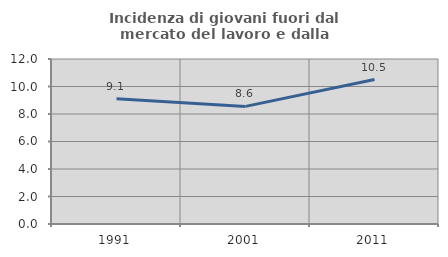
| Category | Incidenza di giovani fuori dal mercato del lavoro e dalla formazione  |
|---|---|
| 1991.0 | 9.113 |
| 2001.0 | 8.553 |
| 2011.0 | 10.508 |